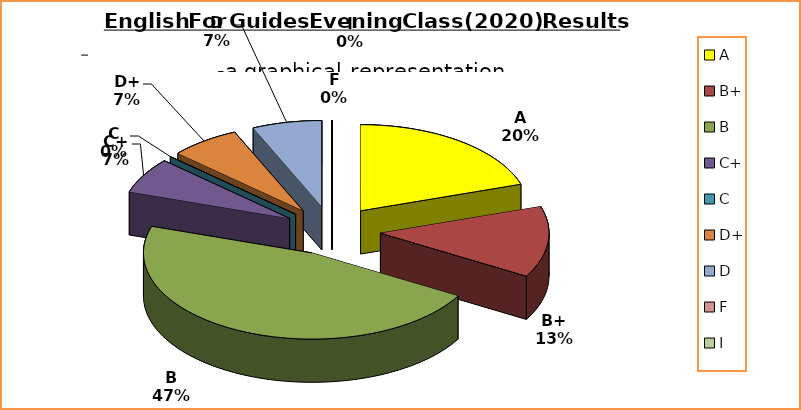
| Category | Series 0 |
|---|---|
| A | 3 |
| B+ | 2 |
| B | 7 |
| C+ | 1 |
| C | 0 |
| D+ | 1 |
| D | 1 |
| F | 0 |
| I | 0 |